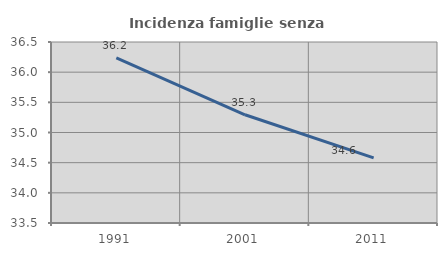
| Category | Incidenza famiglie senza nuclei |
|---|---|
| 1991.0 | 36.239 |
| 2001.0 | 35.294 |
| 2011.0 | 34.579 |